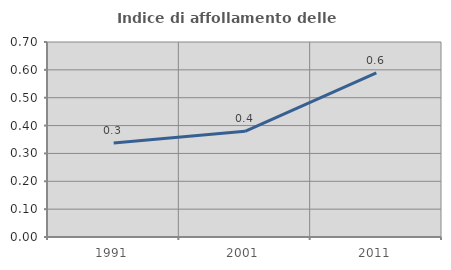
| Category | Indice di affollamento delle abitazioni  |
|---|---|
| 1991.0 | 0.338 |
| 2001.0 | 0.379 |
| 2011.0 | 0.589 |